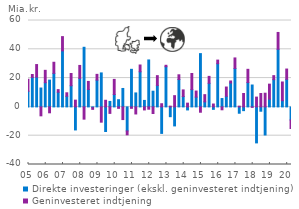
| Category | Direkte investeringer (ekskl. geninvesteret indtjening) | Geninvesteret indtjening |
|---|---|---|
| 05 | 10.9 | 8.3 |
| 05 | 20.5 | 2 |
| 05 | 20.7 | 8.7 |
| 05 | 13.1 | -6.2 |
| 06 | 16.8 | 8.6 |
| 06 | 18.6 | -4.1 |
| 06 | 23.3 | 7.7 |
| 06 | 10.2 | 1.8 |
| 07 | 38.9 | 9.9 |
| 07 | 7.4 | 2.4 |
| 07 | 14.7 | 8.5 |
| 07 | -16 | 4.7 |
| 08 | 19.8 | 9 |
| 08 | 41.4 | -8.5 |
| 08 | 12.1 | 5.6 |
| 08 | -0.5 | -1.2 |
| 09 | 18.6 | 4 |
| 09 | 23.6 | -10.6 |
| 09 | -17.1 | 4.6 |
| 09 | 3.8 | -4.5 |
| 10 | 8.6 | 10.5 |
| 10 | 5 | -1 |
| 10 | 12.8 | -8.8 |
| 10 | -16.7 | -2.7 |
| 11 | 26.1 | -1 |
| 11 | 9.7 | -4.9 |
| 11 | 24.4 | 4.7 |
| 11 | 4.5 | -2.1 |
| 12 | 32.6 | -1.6 |
| 12 | 10.9 | -4.6 |
| 12 | 14.9 | 6.8 |
| 12 | -18.4 | 2.2 |
| 13 | 27.9 | 1 |
| 13 | -6.8 | 0.5 |
| 13 | -13.2 | 7.8 |
| 13 | 19 | 3.3 |
| 14 | 7.2 | 4.6 |
| 14 | -2.1 | 2.6 |
| 14 | 12 | 11.2 |
| 14 | 6.8 | 4.2 |
| 15 | 37 | -3.7 |
| 15 | 3.5 | 5 |
| 15 | 16.4 | 4.8 |
| 15 | -1.7 | 2 |
| 16 | 30 | 2.5 |
| 16 | 5.8 | -2 |
| 16 | 7.4 | 6.4 |
| 16 | 16.6 | 1.4 |
| 17 | 26.7 | 7.3 |
| 17 | -4.4 | 0.5 |
| 17 | -2.6 | 9.3 |
| 17 | 16.9 | 9.2 |
| 18 | 15.2 | -0.3 |
| 18 | -25 | 6.8 |
| 18 | -3 | 9.3 |
| 18 | -19.5 | 9.5 |
| 19 | 5.4 | 10.4 |
| 19 | 18.9 | 2.8 |
| 19 | 40 | 11.7 |
| 19 | 4.3 | 13 |
| 20 | 19.163 | 7.125 |
| 20 | -9.023 | -6.034 |